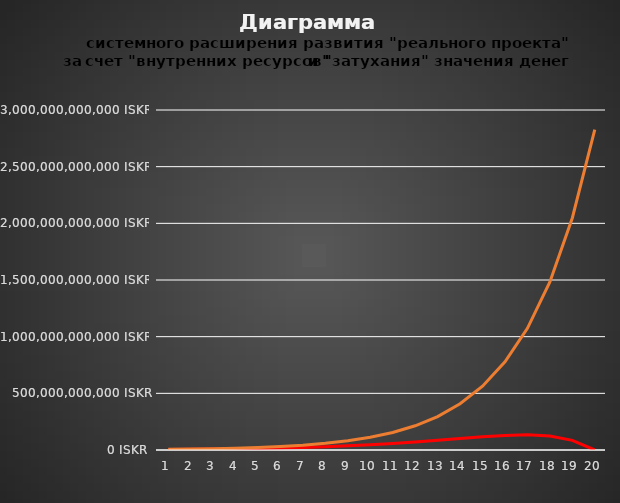
| Category | Series 0 | Series 1 |
|---|---|---|
| 0 | 4834632640.856 | 6137566137.566 |
| 1 | 6325008116.608 | 8475686570.925 |
| 2 | 8249283072.719 | 11704519550.325 |
| 3 | 10721757270.985 | 16163384140.924 |
| 4 | 13880846466.9 | 22320863813.657 |
| 5 | 17890868779.56 | 30824050028.384 |
| 6 | 22941692278.552 | 42566545277.292 |
| 7 | 29244354992.439 | 58782372049.594 |
| 8 | 37019639851.54 | 81175656639.916 |
| 9 | 46474872540.895 | 112099716312.265 |
| 10 | 57761627300.826 | 154804370145.509 |
| 11 | 70903161554.454 | 213777463534.274 |
| 12 | 85674653544.965 | 295216497261.617 |
| 13 | 101410814400.162 | 407679924789.852 |
| 14 | 116702921333.52 | 562986562805.034 |
| 15 | 128928941663.699 | 777457634349.809 |
| 16 | 133533546723.117 | 1073631971244.974 |
| 17 | 122935646189.536 | 1482634626957.346 |
| 18 | 84884136654.68 | 2047447818179.192 |
| 19 | 0 | 2827427939390.314 |